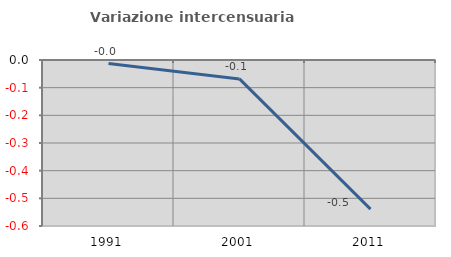
| Category | Variazione intercensuaria annua |
|---|---|
| 1991.0 | -0.013 |
| 2001.0 | -0.068 |
| 2011.0 | -0.539 |